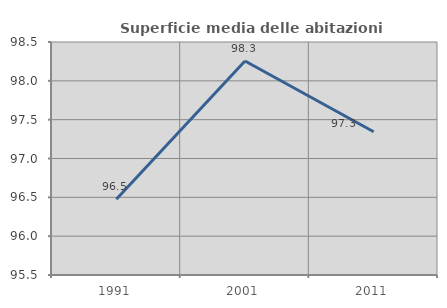
| Category | Superficie media delle abitazioni occupate |
|---|---|
| 1991.0 | 96.477 |
| 2001.0 | 98.255 |
| 2011.0 | 97.344 |